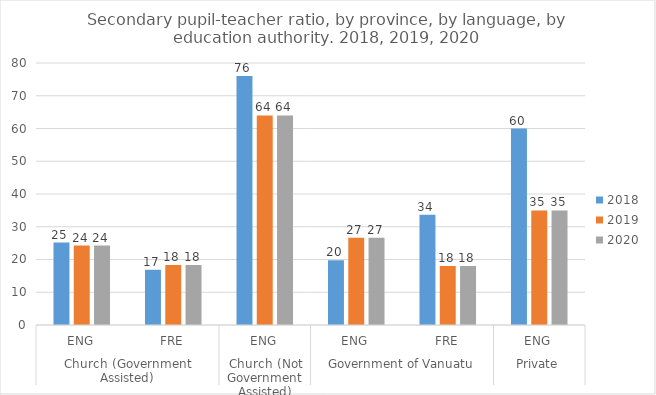
| Category | 2018 | 2019 | 2020 |
|---|---|---|---|
| 0 | 25.159 | 24.247 | 24.247 |
| 1 | 16.886 | 18.358 | 18.358 |
| 2 | 76 | 64 | 64 |
| 3 | 19.763 | 26.626 | 26.626 |
| 4 | 33.702 | 18.033 | 18.033 |
| 5 | 60 | 35 | 35 |